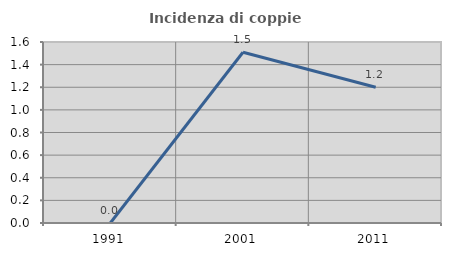
| Category | Incidenza di coppie miste |
|---|---|
| 1991.0 | 0 |
| 2001.0 | 1.509 |
| 2011.0 | 1.2 |